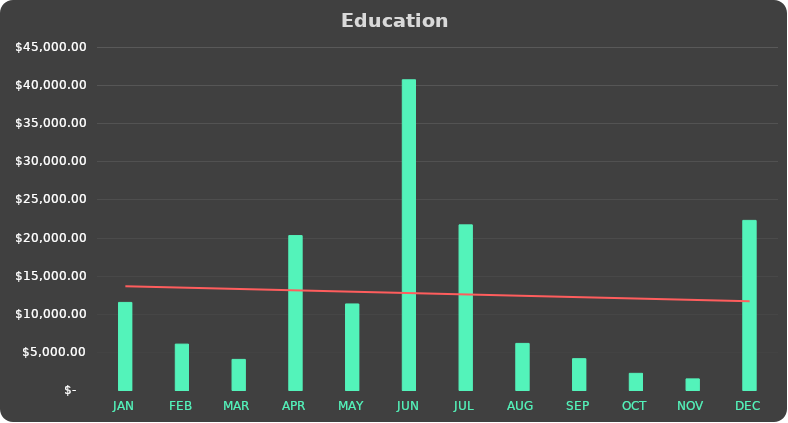
| Category | Series 0 |
|---|---|
| JAN | 11490 |
| FEB | 6020 |
| MAR | 4014 |
| APR | 20261 |
| MAY | 11292 |
| JUN | 40701 |
| JUL | 21664 |
| AUG | 6114 |
| SEP | 4111 |
| OCT | 2187 |
| NOV | 1458 |
| DEC | 22253 |